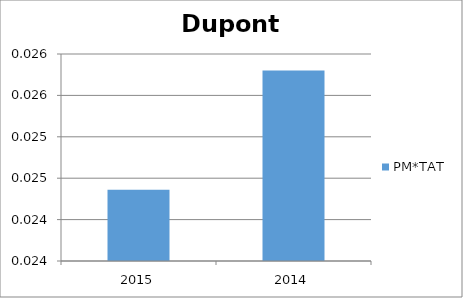
| Category | PM*TAT |
|---|---|
| 2015.0 | 0.024 |
| 2014.0 | 0.026 |